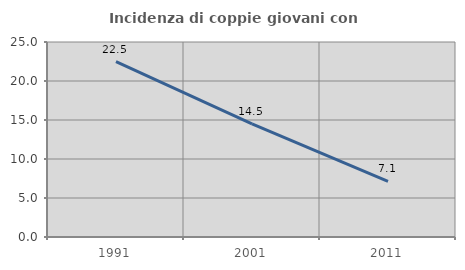
| Category | Incidenza di coppie giovani con figli |
|---|---|
| 1991.0 | 22.47 |
| 2001.0 | 14.513 |
| 2011.0 | 7.138 |